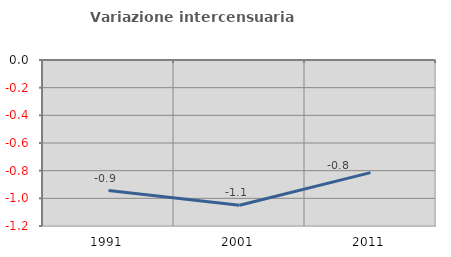
| Category | Variazione intercensuaria annua |
|---|---|
| 1991.0 | -0.944 |
| 2001.0 | -1.05 |
| 2011.0 | -0.814 |